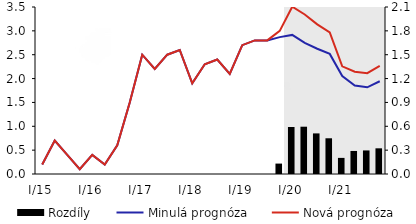
| Category | Rozdíly |
|---|---|
| I/15 | 0 |
| II | 0 |
| III | 0 |
| IV | 0 |
| I/16 | 0 |
| II | 0 |
| III | 0 |
| IV | 0 |
| I/17 | 0 |
| II | 0 |
| III | 0 |
| IV | 0 |
| I/18 | 0 |
| II | 0 |
| III | 0 |
| IV | 0 |
| I/19 | 0 |
| II | 0 |
| III | 0 |
| IV | 0.131 |
| I/20 | 0.591 |
| II | 0.595 |
| III | 0.511 |
| IV | 0.449 |
| I/21 | 0.203 |
| II | 0.29 |
| III | 0.296 |
| IV | 0.323 |